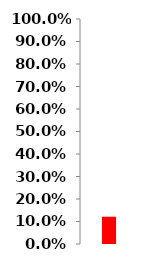
| Category | Series 0 |
|---|---|
| 0 | 0.121 |